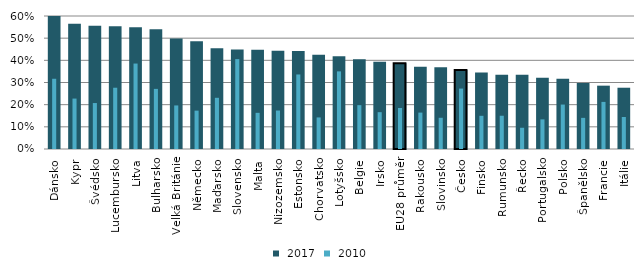
| Category |  2017 |
|---|---|
| Dánsko | 0.601 |
| Kypr | 0.565 |
| Švédsko | 0.556 |
| Lucembursko | 0.554 |
| Litva | 0.549 |
| Bulharsko | 0.54 |
| Velká Británie | 0.499 |
| Německo | 0.486 |
| Maďarsko | 0.455 |
| Slovensko | 0.449 |
| Malta | 0.448 |
| Nizozemsko | 0.443 |
| Estonsko | 0.442 |
| Chorvatsko | 0.425 |
| Lotyšsko | 0.418 |
| Belgie | 0.405 |
| Irsko | 0.393 |
| EU28 průměr | 0.386 |
| Rakousko | 0.371 |
| Slovinsko | 0.368 |
| Česko | 0.356 |
| Finsko | 0.345 |
| Rumunsko | 0.335 |
| Řecko | 0.335 |
| Portugalsko | 0.322 |
| Polsko | 0.317 |
| Španělsko | 0.298 |
| Francie | 0.286 |
| Itálie | 0.276 |